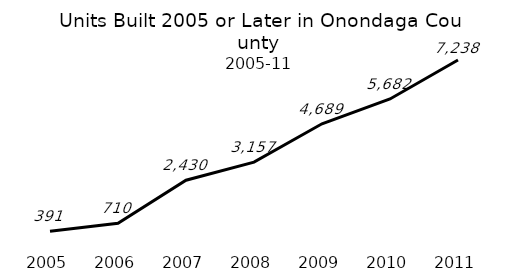
| Category | Series 0 |
|---|---|
| 2005 | 391 |
| 2006 | 710 |
| 2007 | 2430 |
| 2008 | 3157 |
| 2009 | 4689 |
| 2010 | 5682 |
| 2011 | 7238 |